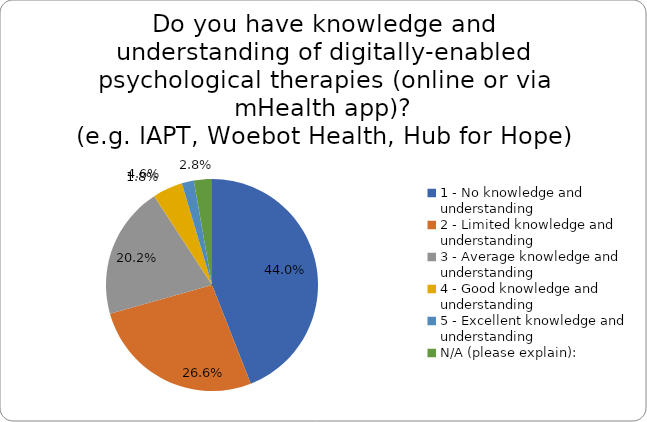
| Category | Series 0 |
|---|---|
| 1 - No knowledge and understanding | 0.44 |
| 2 - Limited knowledge and understanding | 0.266 |
| 3 - Average knowledge and understanding | 0.202 |
| 4 - Good knowledge and understanding | 0.046 |
| 5 - Excellent knowledge and understanding | 0.018 |
| N/A (please explain): | 0.028 |